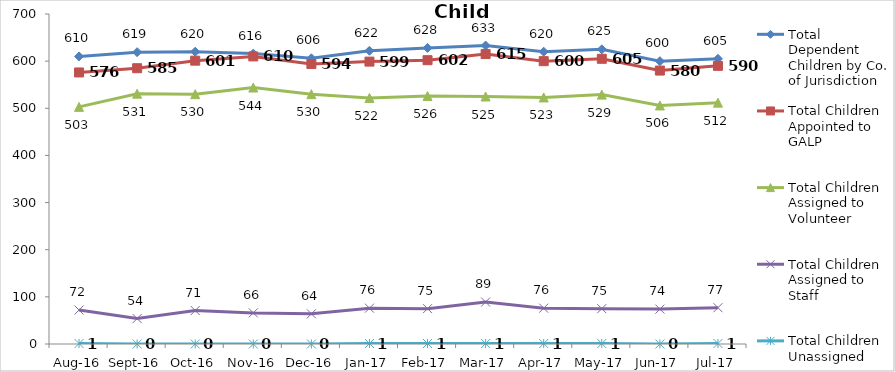
| Category | Total Dependent Children by Co. of Jurisdiction | Total Children Appointed to GALP | Total Children Assigned to Volunteer | Total Children Assigned to Staff | Total Children Unassigned |
|---|---|---|---|---|---|
| Aug-16 | 610 | 576 | 503 | 72 | 1 |
| Sep-16 | 619 | 585 | 531 | 54 | 0 |
| Oct-16 | 620 | 601 | 530 | 71 | 0 |
| Nov-16 | 616 | 610 | 544 | 66 | 0 |
| Dec-16 | 606 | 594 | 530 | 64 | 0 |
| Jan-17 | 622 | 599 | 522 | 76 | 1 |
| Feb-17 | 628 | 602 | 526 | 75 | 1 |
| Mar-17 | 633 | 615 | 525 | 89 | 1 |
| Apr-17 | 620 | 600 | 523 | 76 | 1 |
| May-17 | 625 | 605 | 529 | 75 | 1 |
| Jun-17 | 600 | 580 | 506 | 74 | 0 |
| Jul-17 | 605 | 590 | 512 | 77 | 1 |